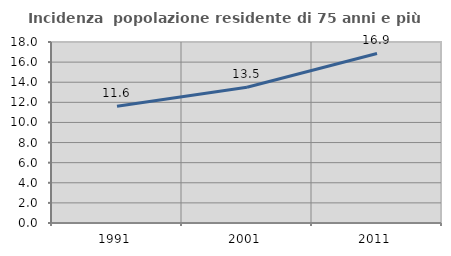
| Category | Incidenza  popolazione residente di 75 anni e più |
|---|---|
| 1991.0 | 11.619 |
| 2001.0 | 13.503 |
| 2011.0 | 16.861 |